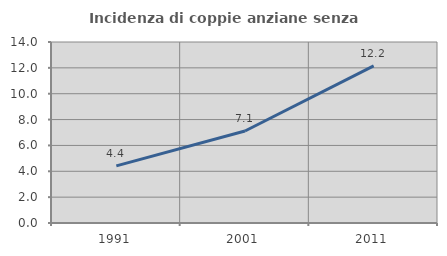
| Category | Incidenza di coppie anziane senza figli  |
|---|---|
| 1991.0 | 4.415 |
| 2001.0 | 7.118 |
| 2011.0 | 12.158 |